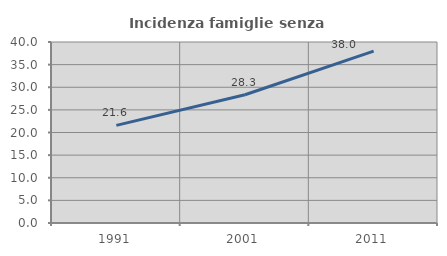
| Category | Incidenza famiglie senza nuclei |
|---|---|
| 1991.0 | 21.569 |
| 2001.0 | 28.338 |
| 2011.0 | 37.968 |